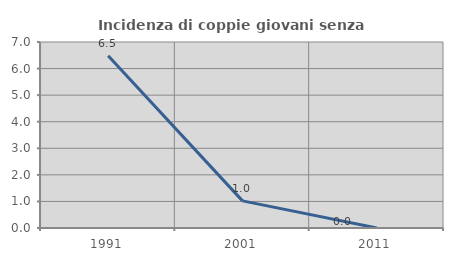
| Category | Incidenza di coppie giovani senza figli |
|---|---|
| 1991.0 | 6.481 |
| 2001.0 | 1.02 |
| 2011.0 | 0 |